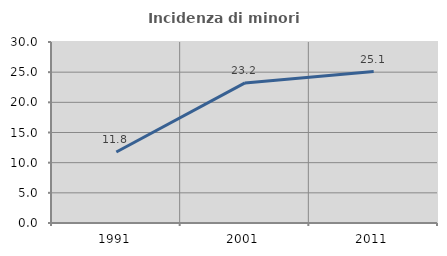
| Category | Incidenza di minori stranieri |
|---|---|
| 1991.0 | 11.765 |
| 2001.0 | 23.214 |
| 2011.0 | 25.095 |